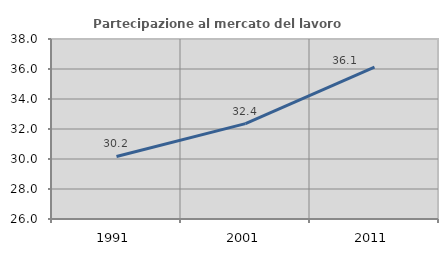
| Category | Partecipazione al mercato del lavoro  femminile |
|---|---|
| 1991.0 | 30.17 |
| 2001.0 | 32.36 |
| 2011.0 | 36.129 |